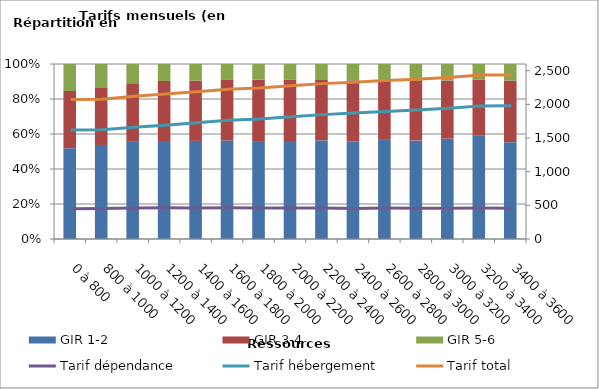
| Category | GIR 1-2 | GIR 3-4 | GIR 5-6 |
|---|---|---|---|
| 0 à 800 | 0.519 | 0.327 | 0.154 |
| 800 à 1000 | 0.537 | 0.326 | 0.137 |
| 1000 à 1200 | 0.555 | 0.335 | 0.11 |
| 1200 à 1400 | 0.56 | 0.343 | 0.097 |
| 1400 à 1600 | 0.561 | 0.344 | 0.095 |
| 1600 à 1800 | 0.563 | 0.349 | 0.088 |
| 1800 à 2000 | 0.555 | 0.355 | 0.09 |
| 2000 à 2200 | 0.56 | 0.35 | 0.091 |
| 2200 à 2400 | 0.563 | 0.349 | 0.088 |
| 2400 à 2600 | 0.556 | 0.35 | 0.093 |
| 2600 à 2800 | 0.567 | 0.345 | 0.088 |
| 2800 à 3000 | 0.564 | 0.343 | 0.093 |
| 3000 à 3200 | 0.574 | 0.332 | 0.095 |
| 3200 à 3400 | 0.592 | 0.32 | 0.088 |
| 3400 à 3600 | 0.553 | 0.352 | 0.095 |